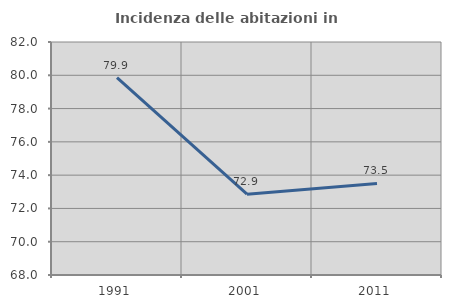
| Category | Incidenza delle abitazioni in proprietà  |
|---|---|
| 1991.0 | 79.853 |
| 2001.0 | 72.853 |
| 2011.0 | 73.499 |